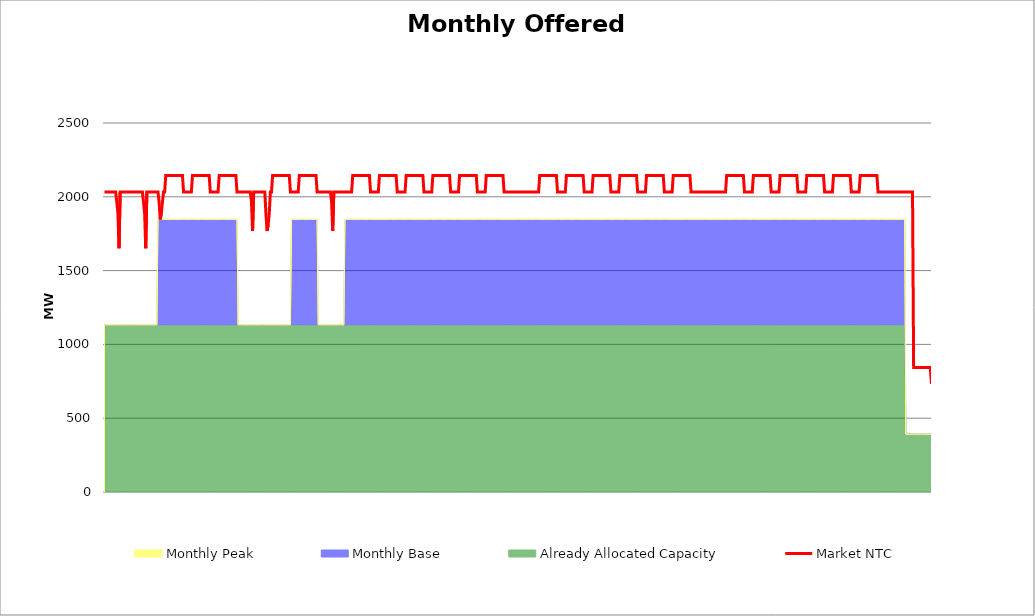
| Category | Market NTC |
|---|---|
| 0 | 2033 |
| 1 | 2033 |
| 2 | 2033 |
| 3 | 2033 |
| 4 | 2033 |
| 5 | 2033 |
| 6 | 2033 |
| 7 | 2033 |
| 8 | 2033 |
| 9 | 2033 |
| 10 | 2033 |
| 11 | 1965 |
| 12 | 1887 |
| 13 | 1651 |
| 14 | 2033 |
| 15 | 2033 |
| 16 | 2033 |
| 17 | 2033 |
| 18 | 2033 |
| 19 | 2033 |
| 20 | 2033 |
| 21 | 2033 |
| 22 | 2033 |
| 23 | 2033 |
| 24 | 2033 |
| 25 | 2033 |
| 26 | 2033 |
| 27 | 2033 |
| 28 | 2033 |
| 29 | 2033 |
| 30 | 2033 |
| 31 | 2033 |
| 32 | 2033 |
| 33 | 2033 |
| 34 | 2033 |
| 35 | 1965 |
| 36 | 1887 |
| 37 | 1651 |
| 38 | 2033 |
| 39 | 2033 |
| 40 | 2033 |
| 41 | 2033 |
| 42 | 2033 |
| 43 | 2033 |
| 44 | 2033 |
| 45 | 2033 |
| 46 | 2033 |
| 47 | 2033 |
| 48 | 2033 |
| 49 | 1965 |
| 50 | 1847 |
| 51 | 1887 |
| 52 | 1965 |
| 53 | 2033 |
| 54 | 2033 |
| 55 | 2144 |
| 56 | 2144 |
| 57 | 2144 |
| 58 | 2144 |
| 59 | 2144 |
| 60 | 2144 |
| 61 | 2144 |
| 62 | 2144 |
| 63 | 2144 |
| 64 | 2144 |
| 65 | 2144 |
| 66 | 2144 |
| 67 | 2144 |
| 68 | 2144 |
| 69 | 2144 |
| 70 | 2144 |
| 71 | 2033 |
| 72 | 2033 |
| 73 | 2033 |
| 74 | 2033 |
| 75 | 2033 |
| 76 | 2033 |
| 77 | 2033 |
| 78 | 2033 |
| 79 | 2144 |
| 80 | 2144 |
| 81 | 2144 |
| 82 | 2144 |
| 83 | 2144 |
| 84 | 2144 |
| 85 | 2144 |
| 86 | 2144 |
| 87 | 2144 |
| 88 | 2144 |
| 89 | 2144 |
| 90 | 2144 |
| 91 | 2144 |
| 92 | 2144 |
| 93 | 2144 |
| 94 | 2144 |
| 95 | 2033 |
| 96 | 2033 |
| 97 | 2033 |
| 98 | 2033 |
| 99 | 2033 |
| 100 | 2033 |
| 101 | 2033 |
| 102 | 2033 |
| 103 | 2144 |
| 104 | 2144 |
| 105 | 2144 |
| 106 | 2144 |
| 107 | 2144 |
| 108 | 2144 |
| 109 | 2144 |
| 110 | 2144 |
| 111 | 2144 |
| 112 | 2144 |
| 113 | 2144 |
| 114 | 2144 |
| 115 | 2144 |
| 116 | 2144 |
| 117 | 2144 |
| 118 | 2144 |
| 119 | 2033 |
| 120 | 2033 |
| 121 | 2033 |
| 122 | 2033 |
| 123 | 2033 |
| 124 | 2033 |
| 125 | 2033 |
| 126 | 2033 |
| 127 | 2033 |
| 128 | 2033 |
| 129 | 2033 |
| 130 | 2033 |
| 131 | 2033 |
| 132 | 1965 |
| 133 | 1769 |
| 134 | 2033 |
| 135 | 2033 |
| 136 | 2033 |
| 137 | 2033 |
| 138 | 2033 |
| 139 | 2033 |
| 140 | 2033 |
| 141 | 2033 |
| 142 | 2033 |
| 143 | 2033 |
| 144 | 2033 |
| 145 | 1887 |
| 146 | 1769 |
| 147 | 1808 |
| 148 | 1887 |
| 149 | 2033 |
| 150 | 2033 |
| 151 | 2144 |
| 152 | 2144 |
| 153 | 2144 |
| 154 | 2144 |
| 155 | 2144 |
| 156 | 2144 |
| 157 | 2144 |
| 158 | 2144 |
| 159 | 2144 |
| 160 | 2144 |
| 161 | 2144 |
| 162 | 2144 |
| 163 | 2144 |
| 164 | 2144 |
| 165 | 2144 |
| 166 | 2144 |
| 167 | 2033 |
| 168 | 2033 |
| 169 | 2033 |
| 170 | 2033 |
| 171 | 2033 |
| 172 | 2033 |
| 173 | 2033 |
| 174 | 2033 |
| 175 | 2144 |
| 176 | 2144 |
| 177 | 2144 |
| 178 | 2144 |
| 179 | 2144 |
| 180 | 2144 |
| 181 | 2144 |
| 182 | 2144 |
| 183 | 2144 |
| 184 | 2144 |
| 185 | 2144 |
| 186 | 2144 |
| 187 | 2144 |
| 188 | 2144 |
| 189 | 2144 |
| 190 | 2144 |
| 191 | 2033 |
| 192 | 2033 |
| 193 | 2033 |
| 194 | 2033 |
| 195 | 2033 |
| 196 | 2033 |
| 197 | 2033 |
| 198 | 2033 |
| 199 | 2033 |
| 200 | 2033 |
| 201 | 2033 |
| 202 | 2033 |
| 203 | 2033 |
| 204 | 1965 |
| 205 | 1769 |
| 206 | 2033 |
| 207 | 2033 |
| 208 | 2033 |
| 209 | 2033 |
| 210 | 2033 |
| 211 | 2033 |
| 212 | 2033 |
| 213 | 2033 |
| 214 | 2033 |
| 215 | 2033 |
| 216 | 2033 |
| 217 | 2033 |
| 218 | 2033 |
| 219 | 2033 |
| 220 | 2033 |
| 221 | 2033 |
| 222 | 2033 |
| 223 | 2144 |
| 224 | 2144 |
| 225 | 2144 |
| 226 | 2144 |
| 227 | 2144 |
| 228 | 2144 |
| 229 | 2144 |
| 230 | 2144 |
| 231 | 2144 |
| 232 | 2144 |
| 233 | 2144 |
| 234 | 2144 |
| 235 | 2144 |
| 236 | 2144 |
| 237 | 2144 |
| 238 | 2144 |
| 239 | 2033 |
| 240 | 2033 |
| 241 | 2033 |
| 242 | 2033 |
| 243 | 2033 |
| 244 | 2033 |
| 245 | 2033 |
| 246 | 2033 |
| 247 | 2144 |
| 248 | 2144 |
| 249 | 2144 |
| 250 | 2144 |
| 251 | 2144 |
| 252 | 2144 |
| 253 | 2144 |
| 254 | 2144 |
| 255 | 2144 |
| 256 | 2144 |
| 257 | 2144 |
| 258 | 2144 |
| 259 | 2144 |
| 260 | 2144 |
| 261 | 2144 |
| 262 | 2144 |
| 263 | 2033 |
| 264 | 2033 |
| 265 | 2033 |
| 266 | 2033 |
| 267 | 2033 |
| 268 | 2033 |
| 269 | 2033 |
| 270 | 2033 |
| 271 | 2144 |
| 272 | 2144 |
| 273 | 2144 |
| 274 | 2144 |
| 275 | 2144 |
| 276 | 2144 |
| 277 | 2144 |
| 278 | 2144 |
| 279 | 2144 |
| 280 | 2144 |
| 281 | 2144 |
| 282 | 2144 |
| 283 | 2144 |
| 284 | 2144 |
| 285 | 2144 |
| 286 | 2144 |
| 287 | 2033 |
| 288 | 2033 |
| 289 | 2033 |
| 290 | 2033 |
| 291 | 2033 |
| 292 | 2033 |
| 293 | 2033 |
| 294 | 2033 |
| 295 | 2144 |
| 296 | 2144 |
| 297 | 2144 |
| 298 | 2144 |
| 299 | 2144 |
| 300 | 2144 |
| 301 | 2144 |
| 302 | 2144 |
| 303 | 2144 |
| 304 | 2144 |
| 305 | 2144 |
| 306 | 2144 |
| 307 | 2144 |
| 308 | 2144 |
| 309 | 2144 |
| 310 | 2144 |
| 311 | 2033 |
| 312 | 2033 |
| 313 | 2033 |
| 314 | 2033 |
| 315 | 2033 |
| 316 | 2033 |
| 317 | 2033 |
| 318 | 2033 |
| 319 | 2144 |
| 320 | 2144 |
| 321 | 2144 |
| 322 | 2144 |
| 323 | 2144 |
| 324 | 2144 |
| 325 | 2144 |
| 326 | 2144 |
| 327 | 2144 |
| 328 | 2144 |
| 329 | 2144 |
| 330 | 2144 |
| 331 | 2144 |
| 332 | 2144 |
| 333 | 2144 |
| 334 | 2144 |
| 335 | 2033 |
| 336 | 2033 |
| 337 | 2033 |
| 338 | 2033 |
| 339 | 2033 |
| 340 | 2033 |
| 341 | 2033 |
| 342 | 2033 |
| 343 | 2144 |
| 344 | 2144 |
| 345 | 2144 |
| 346 | 2144 |
| 347 | 2144 |
| 348 | 2144 |
| 349 | 2144 |
| 350 | 2144 |
| 351 | 2144 |
| 352 | 2144 |
| 353 | 2144 |
| 354 | 2144 |
| 355 | 2144 |
| 356 | 2144 |
| 357 | 2144 |
| 358 | 2144 |
| 359 | 2033 |
| 360 | 2033 |
| 361 | 2033 |
| 362 | 2033 |
| 363 | 2033 |
| 364 | 2033 |
| 365 | 2033 |
| 366 | 2033 |
| 367 | 2033 |
| 368 | 2033 |
| 369 | 2033 |
| 370 | 2033 |
| 371 | 2033 |
| 372 | 2033 |
| 373 | 2033 |
| 374 | 2033 |
| 375 | 2033 |
| 376 | 2033 |
| 377 | 2033 |
| 378 | 2033 |
| 379 | 2033 |
| 380 | 2033 |
| 381 | 2033 |
| 382 | 2033 |
| 383 | 2033 |
| 384 | 2033 |
| 385 | 2033 |
| 386 | 2033 |
| 387 | 2033 |
| 388 | 2033 |
| 389 | 2033 |
| 390 | 2033 |
| 391 | 2144 |
| 392 | 2144 |
| 393 | 2144 |
| 394 | 2144 |
| 395 | 2144 |
| 396 | 2144 |
| 397 | 2144 |
| 398 | 2144 |
| 399 | 2144 |
| 400 | 2144 |
| 401 | 2144 |
| 402 | 2144 |
| 403 | 2144 |
| 404 | 2144 |
| 405 | 2144 |
| 406 | 2144 |
| 407 | 2033 |
| 408 | 2033 |
| 409 | 2033 |
| 410 | 2033 |
| 411 | 2033 |
| 412 | 2033 |
| 413 | 2033 |
| 414 | 2033 |
| 415 | 2144 |
| 416 | 2144 |
| 417 | 2144 |
| 418 | 2144 |
| 419 | 2144 |
| 420 | 2144 |
| 421 | 2144 |
| 422 | 2144 |
| 423 | 2144 |
| 424 | 2144 |
| 425 | 2144 |
| 426 | 2144 |
| 427 | 2144 |
| 428 | 2144 |
| 429 | 2144 |
| 430 | 2144 |
| 431 | 2033 |
| 432 | 2033 |
| 433 | 2033 |
| 434 | 2033 |
| 435 | 2033 |
| 436 | 2033 |
| 437 | 2033 |
| 438 | 2033 |
| 439 | 2144 |
| 440 | 2144 |
| 441 | 2144 |
| 442 | 2144 |
| 443 | 2144 |
| 444 | 2144 |
| 445 | 2144 |
| 446 | 2144 |
| 447 | 2144 |
| 448 | 2144 |
| 449 | 2144 |
| 450 | 2144 |
| 451 | 2144 |
| 452 | 2144 |
| 453 | 2144 |
| 454 | 2144 |
| 455 | 2033 |
| 456 | 2033 |
| 457 | 2033 |
| 458 | 2033 |
| 459 | 2033 |
| 460 | 2033 |
| 461 | 2033 |
| 462 | 2033 |
| 463 | 2144 |
| 464 | 2144 |
| 465 | 2144 |
| 466 | 2144 |
| 467 | 2144 |
| 468 | 2144 |
| 469 | 2144 |
| 470 | 2144 |
| 471 | 2144 |
| 472 | 2144 |
| 473 | 2144 |
| 474 | 2144 |
| 475 | 2144 |
| 476 | 2144 |
| 477 | 2144 |
| 478 | 2144 |
| 479 | 2033 |
| 480 | 2033 |
| 481 | 2033 |
| 482 | 2033 |
| 483 | 2033 |
| 484 | 2033 |
| 485 | 2033 |
| 486 | 2033 |
| 487 | 2144 |
| 488 | 2144 |
| 489 | 2144 |
| 490 | 2144 |
| 491 | 2144 |
| 492 | 2144 |
| 493 | 2144 |
| 494 | 2144 |
| 495 | 2144 |
| 496 | 2144 |
| 497 | 2144 |
| 498 | 2144 |
| 499 | 2144 |
| 500 | 2144 |
| 501 | 2144 |
| 502 | 2144 |
| 503 | 2033 |
| 504 | 2033 |
| 505 | 2033 |
| 506 | 2033 |
| 507 | 2033 |
| 508 | 2033 |
| 509 | 2033 |
| 510 | 2033 |
| 511 | 2144 |
| 512 | 2144 |
| 513 | 2144 |
| 514 | 2144 |
| 515 | 2144 |
| 516 | 2144 |
| 517 | 2144 |
| 518 | 2144 |
| 519 | 2144 |
| 520 | 2144 |
| 521 | 2144 |
| 522 | 2144 |
| 523 | 2144 |
| 524 | 2144 |
| 525 | 2144 |
| 526 | 2144 |
| 527 | 2033 |
| 528 | 2033 |
| 529 | 2033 |
| 530 | 2033 |
| 531 | 2033 |
| 532 | 2033 |
| 533 | 2033 |
| 534 | 2033 |
| 535 | 2033 |
| 536 | 2033 |
| 537 | 2033 |
| 538 | 2033 |
| 539 | 2033 |
| 540 | 2033 |
| 541 | 2033 |
| 542 | 2033 |
| 543 | 2033 |
| 544 | 2033 |
| 545 | 2033 |
| 546 | 2033 |
| 547 | 2033 |
| 548 | 2033 |
| 549 | 2033 |
| 550 | 2033 |
| 551 | 2033 |
| 552 | 2033 |
| 553 | 2033 |
| 554 | 2033 |
| 555 | 2033 |
| 556 | 2033 |
| 557 | 2033 |
| 558 | 2033 |
| 559 | 2144 |
| 560 | 2144 |
| 561 | 2144 |
| 562 | 2144 |
| 563 | 2144 |
| 564 | 2144 |
| 565 | 2144 |
| 566 | 2144 |
| 567 | 2144 |
| 568 | 2144 |
| 569 | 2144 |
| 570 | 2144 |
| 571 | 2144 |
| 572 | 2144 |
| 573 | 2144 |
| 574 | 2144 |
| 575 | 2033 |
| 576 | 2033 |
| 577 | 2033 |
| 578 | 2033 |
| 579 | 2033 |
| 580 | 2033 |
| 581 | 2033 |
| 582 | 2033 |
| 583 | 2144 |
| 584 | 2144 |
| 585 | 2144 |
| 586 | 2144 |
| 587 | 2144 |
| 588 | 2144 |
| 589 | 2144 |
| 590 | 2144 |
| 591 | 2144 |
| 592 | 2144 |
| 593 | 2144 |
| 594 | 2144 |
| 595 | 2144 |
| 596 | 2144 |
| 597 | 2144 |
| 598 | 2144 |
| 599 | 2033 |
| 600 | 2033 |
| 601 | 2033 |
| 602 | 2033 |
| 603 | 2033 |
| 604 | 2033 |
| 605 | 2033 |
| 606 | 2033 |
| 607 | 2144 |
| 608 | 2144 |
| 609 | 2144 |
| 610 | 2144 |
| 611 | 2144 |
| 612 | 2144 |
| 613 | 2144 |
| 614 | 2144 |
| 615 | 2144 |
| 616 | 2144 |
| 617 | 2144 |
| 618 | 2144 |
| 619 | 2144 |
| 620 | 2144 |
| 621 | 2144 |
| 622 | 2144 |
| 623 | 2033 |
| 624 | 2033 |
| 625 | 2033 |
| 626 | 2033 |
| 627 | 2033 |
| 628 | 2033 |
| 629 | 2033 |
| 630 | 2033 |
| 631 | 2144 |
| 632 | 2144 |
| 633 | 2144 |
| 634 | 2144 |
| 635 | 2144 |
| 636 | 2144 |
| 637 | 2144 |
| 638 | 2144 |
| 639 | 2144 |
| 640 | 2144 |
| 641 | 2144 |
| 642 | 2144 |
| 643 | 2144 |
| 644 | 2144 |
| 645 | 2144 |
| 646 | 2144 |
| 647 | 2033 |
| 648 | 2033 |
| 649 | 2033 |
| 650 | 2033 |
| 651 | 2033 |
| 652 | 2033 |
| 653 | 2033 |
| 654 | 2033 |
| 655 | 2144 |
| 656 | 2144 |
| 657 | 2144 |
| 658 | 2144 |
| 659 | 2144 |
| 660 | 2144 |
| 661 | 2144 |
| 662 | 2144 |
| 663 | 2144 |
| 664 | 2144 |
| 665 | 2144 |
| 666 | 2144 |
| 667 | 2144 |
| 668 | 2144 |
| 669 | 2144 |
| 670 | 2144 |
| 671 | 2033 |
| 672 | 2033 |
| 673 | 2033 |
| 674 | 2033 |
| 675 | 2033 |
| 676 | 2033 |
| 677 | 2033 |
| 678 | 2033 |
| 679 | 2144 |
| 680 | 2144 |
| 681 | 2144 |
| 682 | 2144 |
| 683 | 2144 |
| 684 | 2144 |
| 685 | 2144 |
| 686 | 2144 |
| 687 | 2144 |
| 688 | 2144 |
| 689 | 2144 |
| 690 | 2144 |
| 691 | 2144 |
| 692 | 2144 |
| 693 | 2144 |
| 694 | 2144 |
| 695 | 2033 |
| 696 | 2033 |
| 697 | 2033 |
| 698 | 2033 |
| 699 | 2033 |
| 700 | 2033 |
| 701 | 2033 |
| 702 | 2033 |
| 703 | 2033 |
| 704 | 2033 |
| 705 | 2033 |
| 706 | 2033 |
| 707 | 2033 |
| 708 | 2033 |
| 709 | 2033 |
| 710 | 2033 |
| 711 | 2033 |
| 712 | 2033 |
| 713 | 2033 |
| 714 | 2033 |
| 715 | 2033 |
| 716 | 2033 |
| 717 | 2033 |
| 718 | 2033 |
| 719 | 2033 |
| 720 | 2033 |
| 721 | 2033 |
| 722 | 2033 |
| 723 | 2033 |
| 724 | 2033 |
| 725 | 2033 |
| 726 | 2033 |
| 727 | 844 |
| 728 | 844 |
| 729 | 844 |
| 730 | 844 |
| 731 | 844 |
| 732 | 844 |
| 733 | 844 |
| 734 | 844 |
| 735 | 844 |
| 736 | 844 |
| 737 | 844 |
| 738 | 844 |
| 739 | 844 |
| 740 | 844 |
| 741 | 844 |
| 742 | 844 |
| 743 | 733 |